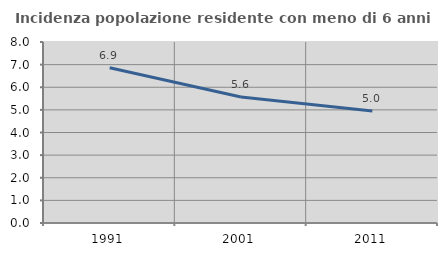
| Category | Incidenza popolazione residente con meno di 6 anni |
|---|---|
| 1991.0 | 6.861 |
| 2001.0 | 5.566 |
| 2011.0 | 4.954 |